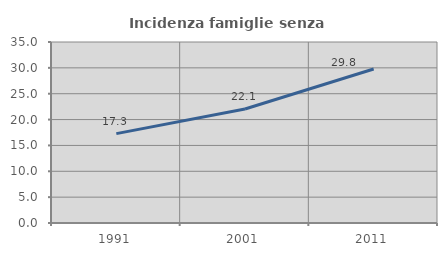
| Category | Incidenza famiglie senza nuclei |
|---|---|
| 1991.0 | 17.279 |
| 2001.0 | 22.054 |
| 2011.0 | 29.777 |